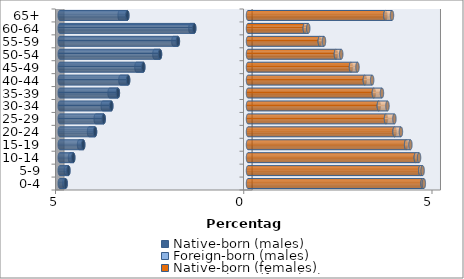
| Category | Native-born (males) | Foreign-born (males) | Native-born (females) | Foreign-born (females) |
|---|---|---|---|---|
| 0-4 | -4.844 | -0.036 | 4.637 | 0.034 |
| 5-9 | -4.771 | -0.064 | 4.576 | 0.062 |
| 10-14 | -4.642 | -0.086 | 4.458 | 0.086 |
| 15-19 | -4.377 | -0.11 | 4.199 | 0.114 |
| 20-24 | -4.063 | -0.16 | 3.893 | 0.169 |
| 25-29 | -3.833 | -0.213 | 3.665 | 0.223 |
| 30-34 | -3.632 | -0.227 | 3.475 | 0.229 |
| 35-39 | -3.456 | -0.221 | 3.343 | 0.215 |
| 40-44 | -3.184 | -0.205 | 3.104 | 0.194 |
| 45-49 | -2.781 | -0.182 | 2.736 | 0.172 |
| 50-54 | -2.337 | -0.149 | 2.335 | 0.141 |
| 55-59 | -1.862 | -0.12 | 1.907 | 0.112 |
| 60-64 | -1.429 | -0.102 | 1.509 | 0.091 |
| 65+ | -3.206 | -0.204 | 3.649 | 0.176 |